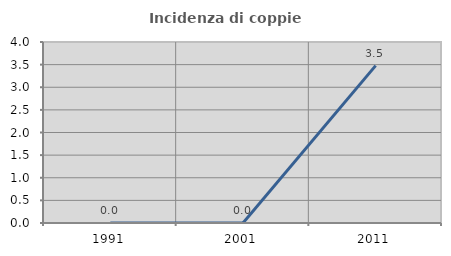
| Category | Incidenza di coppie miste |
|---|---|
| 1991.0 | 0 |
| 2001.0 | 0 |
| 2011.0 | 3.478 |